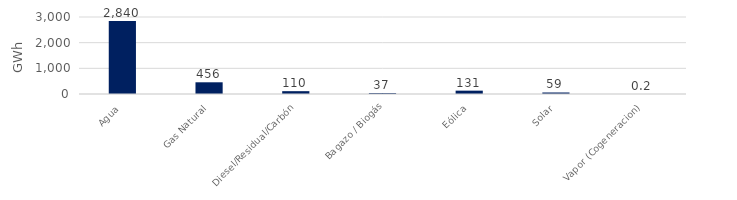
| Category | Series 0 |
|---|---|
| Agua | 2839.647 |
| Gas Natural | 456.11 |
| Diesel/Residual/Carbón | 110.302 |
| Bagazo / Biogás | 37.348 |
| Eólica | 130.606 |
| Solar | 58.928 |
| Vapor (Cogeneracion) | 0.215 |